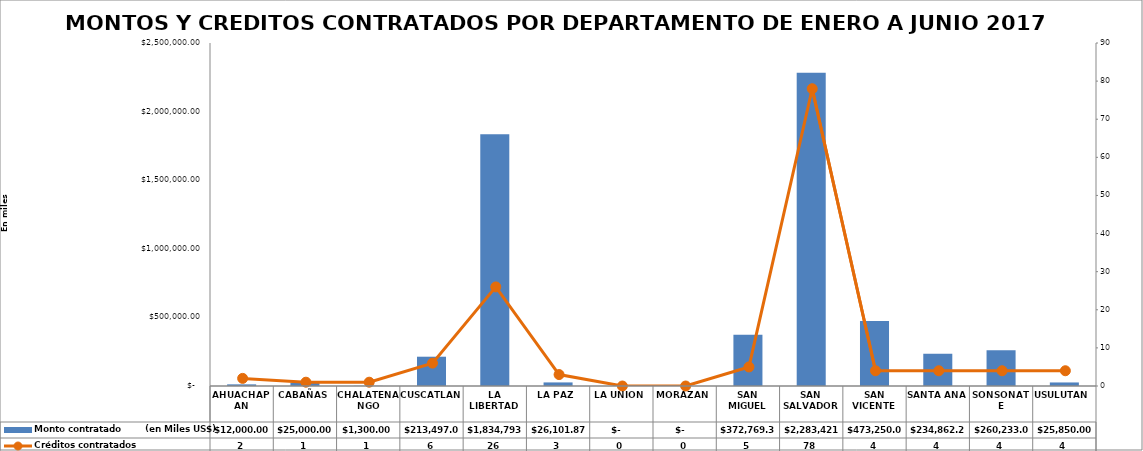
| Category | Monto contratado        (en Miles US$) |
|---|---|
| AHUACHAPAN | 12000 |
| CABAÑAS | 25000 |
| CHALATENANGO | 1300 |
| CUSCATLAN | 213497 |
| LA LIBERTAD | 1834793.95 |
| LA PAZ | 26101.87 |
| LA UNION | 0 |
| MORAZAN | 0 |
| SAN MIGUEL | 372769.3 |
| SAN SALVADOR | 2283421.62 |
| SAN VICENTE | 473250 |
| SANTA ANA | 234862.24 |
| SONSONATE | 260233 |
| USULUTAN | 25850 |